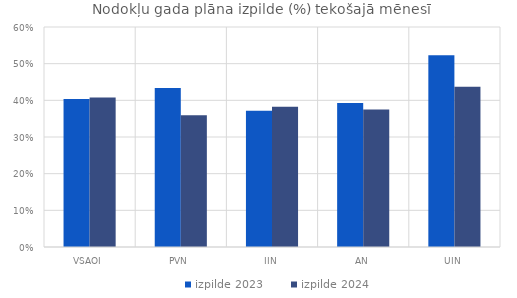
| Category | izpilde 2023 | izpilde 2024 |
|---|---|---|
| VSAOI | 0.404 | 0.408 |
| PVN | 0.434 | 0.359 |
| IIN | 0.371 | 0.383 |
| AN | 0.393 | 0.375 |
| UIN | 0.523 | 0.437 |